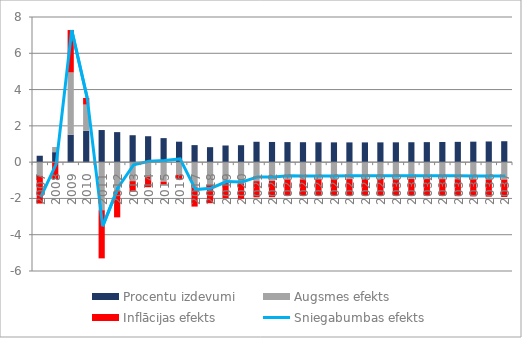
| Category | Procentu izdevumi | Augsmes efekts | Inflācijas efekts |
|---|---|---|---|
| 0 | 0.353 | -0.754 | -1.527 |
| 1 | 0.551 | 0.285 | -0.933 |
| 2 | 1.511 | 3.434 | 2.337 |
| 3 | 1.731 | 1.442 | 0.368 |
| 4 | 1.77 | -2.65 | -2.655 |
| 5 | 1.655 | -1.594 | -1.45 |
| 6 | 1.483 | -1.047 | -0.579 |
| 7 | 1.428 | -0.798 | -0.585 |
| 8 | 1.324 | -1.075 | -0.157 |
| 9 | 1.127 | -0.694 | -0.255 |
| 10 | 0.938 | -1.39 | -1.06 |
| 11 | 0.825 | -1.245 | -1.018 |
| 12 | 0.918 | -1.135 | -0.853 |
| 13 | 0.933 | -1.17 | -0.858 |
| 14 | 1.123 | -1.048 | -0.89 |
| 15 | 1.112 | -1.038 | -0.893 |
| 16 | 1.105 | -0.957 | -0.898 |
| 17 | 1.098 | -0.952 | -0.904 |
| 18 | 1.093 | -0.945 | -0.911 |
| 19 | 1.09 | -0.939 | -0.908 |
| 20 | 1.088 | -0.935 | -0.907 |
| 21 | 1.088 | -0.932 | -0.907 |
| 22 | 1.09 | -0.93 | -0.908 |
| 23 | 1.093 | -0.93 | -0.911 |
| 24 | 1.097 | -0.931 | -0.914 |
| 25 | 1.103 | -0.933 | -0.919 |
| 26 | 1.11 | -0.936 | -0.925 |
| 27 | 1.119 | -0.941 | -0.932 |
| 28 | 1.129 | -0.946 | -0.94 |
| 29 | 1.14 | -0.953 | -0.95 |
| 30 | 1.152 | -0.96 | -0.96 |